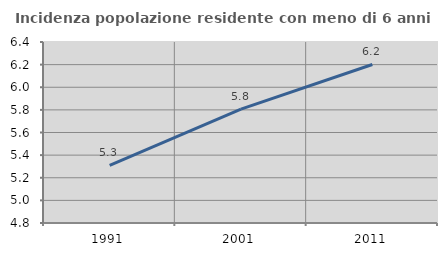
| Category | Incidenza popolazione residente con meno di 6 anni |
|---|---|
| 1991.0 | 5.309 |
| 2001.0 | 5.806 |
| 2011.0 | 6.201 |